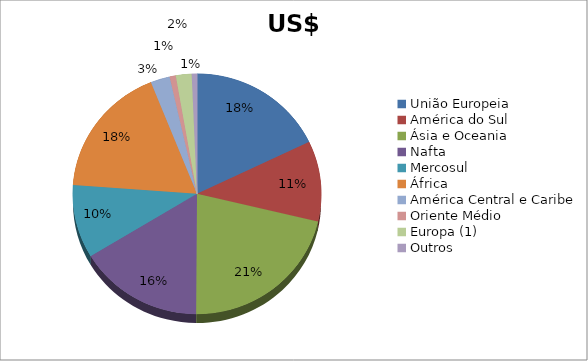
| Category | Series 0 |
|---|---|
| União Europeia | 641881363 |
| América do Sul | 388142303 |
| Ásia e Oceania | 768243966 |
| Nafta | 582414494 |
| Mercosul | 353009892 |
| África | 637830050 |
| América Central e Caribe | 89983837 |
| Oriente Médio | 28596711 |
| Europa (1) | 74087783 |
| Outros | 24427213 |